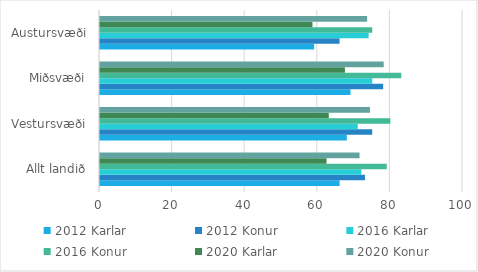
| Category | 2012 | 2016 | 2020 |
|---|---|---|---|
| Allt landið | 73 | 79 | 71.5 |
| Vestursvæði | 75 | 80 | 74.362 |
| Miðsvæði | 78 | 83 | 78.159 |
| Austursvæði | 66 | 75 | 73.585 |